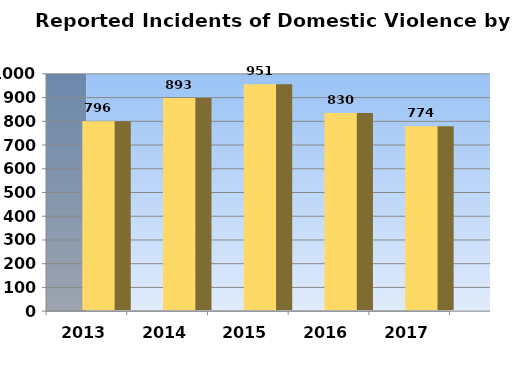
| Category | Series 0 |
|---|---|
| 2013.0 | 796 |
| 2014.0 | 893 |
| 2015.0 | 951 |
| 2016.0 | 830 |
| 2017.0 | 774 |